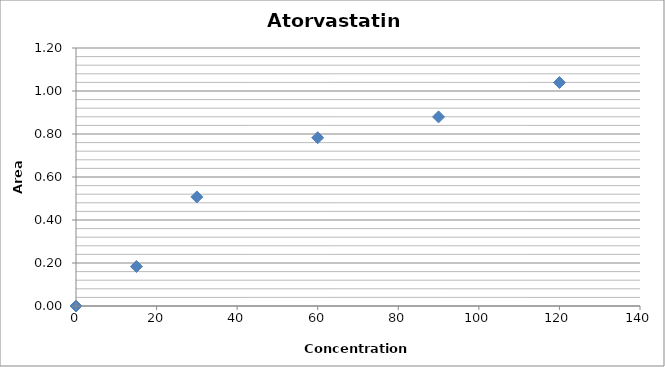
| Category | Series 0 |
|---|---|
| 0.0 | 0 |
| 15.0 | 0.184 |
| 30.0 | 0.507 |
| 60.0 | 0.783 |
| 90.0 | 0.879 |
| 120.0 | 1.039 |